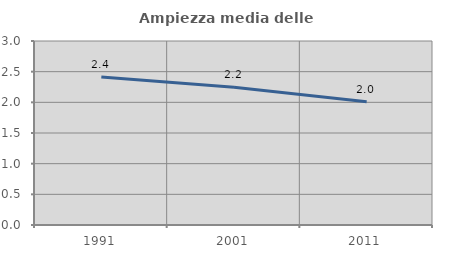
| Category | Ampiezza media delle famiglie |
|---|---|
| 1991.0 | 2.412 |
| 2001.0 | 2.245 |
| 2011.0 | 2.01 |